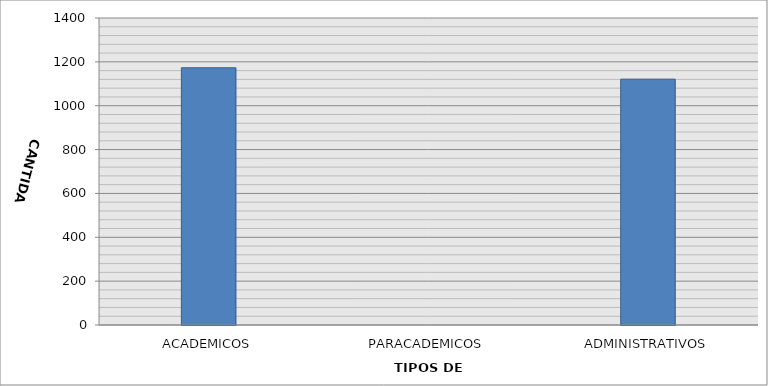
| Category | CANTIDAD |
|---|---|
| ACADEMICOS | 1173 |
| PARACADEMICOS | 0 |
| ADMINISTRATIVOS | 1121 |